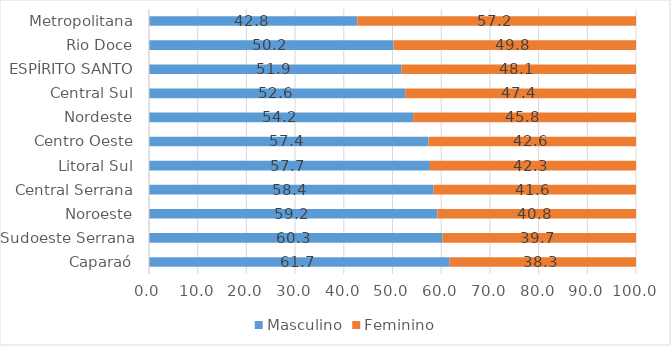
| Category | Masculino | Feminino |
|---|---|---|
| Caparaó | 61.745 | 38.255 |
| Sudoeste Serrana | 60.3 | 39.7 |
| Noroeste | 59.201 | 40.799 |
| Central Serrana | 58.44 | 41.56 |
| Litoral Sul | 57.686 | 42.314 |
| Centro Oeste | 57.398 | 42.602 |
| Nordeste | 54.229 | 45.771 |
| Central Sul | 52.617 | 47.383 |
| ESPÍRITO SANTO | 51.866 | 48.134 |
| Rio Doce | 50.233 | 49.767 |
| Metropolitana | 42.774 | 57.226 |